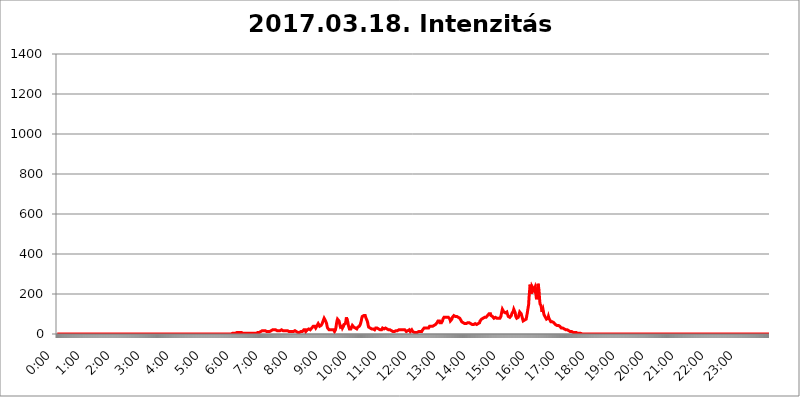
| Category | 2017.03.18. Intenzitás [W/m^2] |
|---|---|
| 0.0 | 0 |
| 0.0006944444444444445 | 0 |
| 0.001388888888888889 | 0 |
| 0.0020833333333333333 | 0 |
| 0.002777777777777778 | 0 |
| 0.003472222222222222 | 0 |
| 0.004166666666666667 | 0 |
| 0.004861111111111111 | 0 |
| 0.005555555555555556 | 0 |
| 0.0062499999999999995 | 0 |
| 0.006944444444444444 | 0 |
| 0.007638888888888889 | 0 |
| 0.008333333333333333 | 0 |
| 0.009027777777777779 | 0 |
| 0.009722222222222222 | 0 |
| 0.010416666666666666 | 0 |
| 0.011111111111111112 | 0 |
| 0.011805555555555555 | 0 |
| 0.012499999999999999 | 0 |
| 0.013194444444444444 | 0 |
| 0.013888888888888888 | 0 |
| 0.014583333333333332 | 0 |
| 0.015277777777777777 | 0 |
| 0.015972222222222224 | 0 |
| 0.016666666666666666 | 0 |
| 0.017361111111111112 | 0 |
| 0.018055555555555557 | 0 |
| 0.01875 | 0 |
| 0.019444444444444445 | 0 |
| 0.02013888888888889 | 0 |
| 0.020833333333333332 | 0 |
| 0.02152777777777778 | 0 |
| 0.022222222222222223 | 0 |
| 0.02291666666666667 | 0 |
| 0.02361111111111111 | 0 |
| 0.024305555555555556 | 0 |
| 0.024999999999999998 | 0 |
| 0.025694444444444447 | 0 |
| 0.02638888888888889 | 0 |
| 0.027083333333333334 | 0 |
| 0.027777777777777776 | 0 |
| 0.02847222222222222 | 0 |
| 0.029166666666666664 | 0 |
| 0.029861111111111113 | 0 |
| 0.030555555555555555 | 0 |
| 0.03125 | 0 |
| 0.03194444444444445 | 0 |
| 0.03263888888888889 | 0 |
| 0.03333333333333333 | 0 |
| 0.034027777777777775 | 0 |
| 0.034722222222222224 | 0 |
| 0.035416666666666666 | 0 |
| 0.036111111111111115 | 0 |
| 0.03680555555555556 | 0 |
| 0.0375 | 0 |
| 0.03819444444444444 | 0 |
| 0.03888888888888889 | 0 |
| 0.03958333333333333 | 0 |
| 0.04027777777777778 | 0 |
| 0.04097222222222222 | 0 |
| 0.041666666666666664 | 0 |
| 0.042361111111111106 | 0 |
| 0.04305555555555556 | 0 |
| 0.043750000000000004 | 0 |
| 0.044444444444444446 | 0 |
| 0.04513888888888889 | 0 |
| 0.04583333333333334 | 0 |
| 0.04652777777777778 | 0 |
| 0.04722222222222222 | 0 |
| 0.04791666666666666 | 0 |
| 0.04861111111111111 | 0 |
| 0.049305555555555554 | 0 |
| 0.049999999999999996 | 0 |
| 0.05069444444444445 | 0 |
| 0.051388888888888894 | 0 |
| 0.052083333333333336 | 0 |
| 0.05277777777777778 | 0 |
| 0.05347222222222222 | 0 |
| 0.05416666666666667 | 0 |
| 0.05486111111111111 | 0 |
| 0.05555555555555555 | 0 |
| 0.05625 | 0 |
| 0.05694444444444444 | 0 |
| 0.057638888888888885 | 0 |
| 0.05833333333333333 | 0 |
| 0.05902777777777778 | 0 |
| 0.059722222222222225 | 0 |
| 0.06041666666666667 | 0 |
| 0.061111111111111116 | 0 |
| 0.06180555555555556 | 0 |
| 0.0625 | 0 |
| 0.06319444444444444 | 0 |
| 0.06388888888888888 | 0 |
| 0.06458333333333334 | 0 |
| 0.06527777777777778 | 0 |
| 0.06597222222222222 | 0 |
| 0.06666666666666667 | 0 |
| 0.06736111111111111 | 0 |
| 0.06805555555555555 | 0 |
| 0.06874999999999999 | 0 |
| 0.06944444444444443 | 0 |
| 0.07013888888888889 | 0 |
| 0.07083333333333333 | 0 |
| 0.07152777777777779 | 0 |
| 0.07222222222222223 | 0 |
| 0.07291666666666667 | 0 |
| 0.07361111111111111 | 0 |
| 0.07430555555555556 | 0 |
| 0.075 | 0 |
| 0.07569444444444444 | 0 |
| 0.0763888888888889 | 0 |
| 0.07708333333333334 | 0 |
| 0.07777777777777778 | 0 |
| 0.07847222222222222 | 0 |
| 0.07916666666666666 | 0 |
| 0.0798611111111111 | 0 |
| 0.08055555555555556 | 0 |
| 0.08125 | 0 |
| 0.08194444444444444 | 0 |
| 0.08263888888888889 | 0 |
| 0.08333333333333333 | 0 |
| 0.08402777777777777 | 0 |
| 0.08472222222222221 | 0 |
| 0.08541666666666665 | 0 |
| 0.08611111111111112 | 0 |
| 0.08680555555555557 | 0 |
| 0.08750000000000001 | 0 |
| 0.08819444444444445 | 0 |
| 0.08888888888888889 | 0 |
| 0.08958333333333333 | 0 |
| 0.09027777777777778 | 0 |
| 0.09097222222222222 | 0 |
| 0.09166666666666667 | 0 |
| 0.09236111111111112 | 0 |
| 0.09305555555555556 | 0 |
| 0.09375 | 0 |
| 0.09444444444444444 | 0 |
| 0.09513888888888888 | 0 |
| 0.09583333333333333 | 0 |
| 0.09652777777777777 | 0 |
| 0.09722222222222222 | 0 |
| 0.09791666666666667 | 0 |
| 0.09861111111111111 | 0 |
| 0.09930555555555555 | 0 |
| 0.09999999999999999 | 0 |
| 0.10069444444444443 | 0 |
| 0.1013888888888889 | 0 |
| 0.10208333333333335 | 0 |
| 0.10277777777777779 | 0 |
| 0.10347222222222223 | 0 |
| 0.10416666666666667 | 0 |
| 0.10486111111111111 | 0 |
| 0.10555555555555556 | 0 |
| 0.10625 | 0 |
| 0.10694444444444444 | 0 |
| 0.1076388888888889 | 0 |
| 0.10833333333333334 | 0 |
| 0.10902777777777778 | 0 |
| 0.10972222222222222 | 0 |
| 0.1111111111111111 | 0 |
| 0.11180555555555556 | 0 |
| 0.11180555555555556 | 0 |
| 0.1125 | 0 |
| 0.11319444444444444 | 0 |
| 0.11388888888888889 | 0 |
| 0.11458333333333333 | 0 |
| 0.11527777777777777 | 0 |
| 0.11597222222222221 | 0 |
| 0.11666666666666665 | 0 |
| 0.1173611111111111 | 0 |
| 0.11805555555555557 | 0 |
| 0.11944444444444445 | 0 |
| 0.12013888888888889 | 0 |
| 0.12083333333333333 | 0 |
| 0.12152777777777778 | 0 |
| 0.12222222222222223 | 0 |
| 0.12291666666666667 | 0 |
| 0.12291666666666667 | 0 |
| 0.12361111111111112 | 0 |
| 0.12430555555555556 | 0 |
| 0.125 | 0 |
| 0.12569444444444444 | 0 |
| 0.12638888888888888 | 0 |
| 0.12708333333333333 | 0 |
| 0.16875 | 0 |
| 0.12847222222222224 | 0 |
| 0.12916666666666668 | 0 |
| 0.12986111111111112 | 0 |
| 0.13055555555555556 | 0 |
| 0.13125 | 0 |
| 0.13194444444444445 | 0 |
| 0.1326388888888889 | 0 |
| 0.13333333333333333 | 0 |
| 0.13402777777777777 | 0 |
| 0.13402777777777777 | 0 |
| 0.13472222222222222 | 0 |
| 0.13541666666666666 | 0 |
| 0.1361111111111111 | 0 |
| 0.13749999999999998 | 0 |
| 0.13819444444444443 | 0 |
| 0.1388888888888889 | 0 |
| 0.13958333333333334 | 0 |
| 0.14027777777777778 | 0 |
| 0.14097222222222222 | 0 |
| 0.14166666666666666 | 0 |
| 0.1423611111111111 | 0 |
| 0.14305555555555557 | 0 |
| 0.14375000000000002 | 0 |
| 0.14444444444444446 | 0 |
| 0.1451388888888889 | 0 |
| 0.1451388888888889 | 0 |
| 0.14652777777777778 | 0 |
| 0.14722222222222223 | 0 |
| 0.14791666666666667 | 0 |
| 0.1486111111111111 | 0 |
| 0.14930555555555555 | 0 |
| 0.15 | 0 |
| 0.15069444444444444 | 0 |
| 0.15138888888888888 | 0 |
| 0.15208333333333332 | 0 |
| 0.15277777777777776 | 0 |
| 0.15347222222222223 | 0 |
| 0.15416666666666667 | 0 |
| 0.15486111111111112 | 0 |
| 0.15555555555555556 | 0 |
| 0.15625 | 0 |
| 0.15694444444444444 | 0 |
| 0.15763888888888888 | 0 |
| 0.15833333333333333 | 0 |
| 0.15902777777777777 | 0 |
| 0.15972222222222224 | 0 |
| 0.16041666666666668 | 0 |
| 0.16111111111111112 | 0 |
| 0.16180555555555556 | 0 |
| 0.1625 | 0 |
| 0.16319444444444445 | 0 |
| 0.1638888888888889 | 0 |
| 0.16458333333333333 | 0 |
| 0.16527777777777777 | 0 |
| 0.16597222222222222 | 0 |
| 0.16666666666666666 | 0 |
| 0.1673611111111111 | 0 |
| 0.16805555555555554 | 0 |
| 0.16874999999999998 | 0 |
| 0.16944444444444443 | 0 |
| 0.17013888888888887 | 0 |
| 0.1708333333333333 | 0 |
| 0.17152777777777775 | 0 |
| 0.17222222222222225 | 0 |
| 0.1729166666666667 | 0 |
| 0.17361111111111113 | 0 |
| 0.17430555555555557 | 0 |
| 0.17500000000000002 | 0 |
| 0.17569444444444446 | 0 |
| 0.1763888888888889 | 0 |
| 0.17708333333333334 | 0 |
| 0.17777777777777778 | 0 |
| 0.17847222222222223 | 0 |
| 0.17916666666666667 | 0 |
| 0.1798611111111111 | 0 |
| 0.18055555555555555 | 0 |
| 0.18125 | 0 |
| 0.18194444444444444 | 0 |
| 0.1826388888888889 | 0 |
| 0.18333333333333335 | 0 |
| 0.1840277777777778 | 0 |
| 0.18472222222222223 | 0 |
| 0.18541666666666667 | 0 |
| 0.18611111111111112 | 0 |
| 0.18680555555555556 | 0 |
| 0.1875 | 0 |
| 0.18819444444444444 | 0 |
| 0.18888888888888888 | 0 |
| 0.18958333333333333 | 0 |
| 0.19027777777777777 | 0 |
| 0.1909722222222222 | 0 |
| 0.19166666666666665 | 0 |
| 0.19236111111111112 | 0 |
| 0.19305555555555554 | 0 |
| 0.19375 | 0 |
| 0.19444444444444445 | 0 |
| 0.1951388888888889 | 0 |
| 0.19583333333333333 | 0 |
| 0.19652777777777777 | 0 |
| 0.19722222222222222 | 0 |
| 0.19791666666666666 | 0 |
| 0.1986111111111111 | 0 |
| 0.19930555555555554 | 0 |
| 0.19999999999999998 | 0 |
| 0.20069444444444443 | 0 |
| 0.20138888888888887 | 0 |
| 0.2020833333333333 | 0 |
| 0.2027777777777778 | 0 |
| 0.2034722222222222 | 0 |
| 0.2041666666666667 | 0 |
| 0.20486111111111113 | 0 |
| 0.20555555555555557 | 0 |
| 0.20625000000000002 | 0 |
| 0.20694444444444446 | 0 |
| 0.2076388888888889 | 0 |
| 0.20833333333333334 | 0 |
| 0.20902777777777778 | 0 |
| 0.20972222222222223 | 0 |
| 0.21041666666666667 | 0 |
| 0.2111111111111111 | 0 |
| 0.21180555555555555 | 0 |
| 0.2125 | 0 |
| 0.21319444444444444 | 0 |
| 0.2138888888888889 | 0 |
| 0.21458333333333335 | 0 |
| 0.2152777777777778 | 0 |
| 0.21597222222222223 | 0 |
| 0.21666666666666667 | 0 |
| 0.21736111111111112 | 0 |
| 0.21805555555555556 | 0 |
| 0.21875 | 0 |
| 0.21944444444444444 | 0 |
| 0.22013888888888888 | 0 |
| 0.22083333333333333 | 0 |
| 0.22152777777777777 | 0 |
| 0.2222222222222222 | 0 |
| 0.22291666666666665 | 0 |
| 0.2236111111111111 | 0 |
| 0.22430555555555556 | 0 |
| 0.225 | 0 |
| 0.22569444444444445 | 0 |
| 0.2263888888888889 | 0 |
| 0.22708333333333333 | 0 |
| 0.22777777777777777 | 0 |
| 0.22847222222222222 | 0 |
| 0.22916666666666666 | 0 |
| 0.2298611111111111 | 0 |
| 0.23055555555555554 | 0 |
| 0.23124999999999998 | 0 |
| 0.23194444444444443 | 0 |
| 0.23263888888888887 | 0 |
| 0.2333333333333333 | 0 |
| 0.2340277777777778 | 0 |
| 0.2347222222222222 | 0 |
| 0.2354166666666667 | 0 |
| 0.23611111111111113 | 0 |
| 0.23680555555555557 | 0 |
| 0.23750000000000002 | 0 |
| 0.23819444444444446 | 0 |
| 0.2388888888888889 | 0 |
| 0.23958333333333334 | 0 |
| 0.24027777777777778 | 0 |
| 0.24097222222222223 | 0 |
| 0.24166666666666667 | 0 |
| 0.2423611111111111 | 0 |
| 0.24305555555555555 | 0 |
| 0.24375 | 0 |
| 0.24444444444444446 | 0 |
| 0.24513888888888888 | 0 |
| 0.24583333333333335 | 3.525 |
| 0.2465277777777778 | 0 |
| 0.24722222222222223 | 3.525 |
| 0.24791666666666667 | 3.525 |
| 0.24861111111111112 | 3.525 |
| 0.24930555555555556 | 3.525 |
| 0.25 | 3.525 |
| 0.25069444444444444 | 7.887 |
| 0.2513888888888889 | 7.887 |
| 0.2520833333333333 | 7.887 |
| 0.25277777777777777 | 7.887 |
| 0.2534722222222222 | 7.887 |
| 0.25416666666666665 | 7.887 |
| 0.2548611111111111 | 7.887 |
| 0.2555555555555556 | 7.887 |
| 0.25625000000000003 | 7.887 |
| 0.2569444444444445 | 7.887 |
| 0.2576388888888889 | 7.887 |
| 0.25833333333333336 | 7.887 |
| 0.2590277777777778 | 7.887 |
| 0.25972222222222224 | 7.887 |
| 0.2604166666666667 | 3.525 |
| 0.2611111111111111 | 3.525 |
| 0.26180555555555557 | 3.525 |
| 0.2625 | 3.525 |
| 0.26319444444444445 | 3.525 |
| 0.2638888888888889 | 3.525 |
| 0.26458333333333334 | 3.525 |
| 0.2652777777777778 | 3.525 |
| 0.2659722222222222 | 3.525 |
| 0.26666666666666666 | 3.525 |
| 0.2673611111111111 | 3.525 |
| 0.26805555555555555 | 3.525 |
| 0.26875 | 3.525 |
| 0.26944444444444443 | 3.525 |
| 0.2701388888888889 | 3.525 |
| 0.2708333333333333 | 3.525 |
| 0.27152777777777776 | 3.525 |
| 0.2722222222222222 | 3.525 |
| 0.27291666666666664 | 3.525 |
| 0.2736111111111111 | 3.525 |
| 0.2743055555555555 | 3.525 |
| 0.27499999999999997 | 3.525 |
| 0.27569444444444446 | 3.525 |
| 0.27638888888888885 | 3.525 |
| 0.27708333333333335 | 3.525 |
| 0.2777777777777778 | 3.525 |
| 0.27847222222222223 | 3.525 |
| 0.2791666666666667 | 3.525 |
| 0.2798611111111111 | 3.525 |
| 0.28055555555555556 | 3.525 |
| 0.28125 | 7.887 |
| 0.28194444444444444 | 7.887 |
| 0.2826388888888889 | 7.887 |
| 0.2833333333333333 | 7.887 |
| 0.28402777777777777 | 7.887 |
| 0.2847222222222222 | 12.257 |
| 0.28541666666666665 | 12.257 |
| 0.28611111111111115 | 12.257 |
| 0.28680555555555554 | 12.257 |
| 0.28750000000000003 | 16.636 |
| 0.2881944444444445 | 16.636 |
| 0.2888888888888889 | 16.636 |
| 0.28958333333333336 | 16.636 |
| 0.2902777777777778 | 16.636 |
| 0.29097222222222224 | 12.257 |
| 0.2916666666666667 | 16.636 |
| 0.2923611111111111 | 12.257 |
| 0.29305555555555557 | 12.257 |
| 0.29375 | 12.257 |
| 0.29444444444444445 | 16.636 |
| 0.2951388888888889 | 12.257 |
| 0.29583333333333334 | 12.257 |
| 0.2965277777777778 | 12.257 |
| 0.2972222222222222 | 12.257 |
| 0.29791666666666666 | 12.257 |
| 0.2986111111111111 | 12.257 |
| 0.29930555555555555 | 12.257 |
| 0.3 | 16.636 |
| 0.30069444444444443 | 16.636 |
| 0.3013888888888889 | 16.636 |
| 0.3020833333333333 | 21.024 |
| 0.30277777777777776 | 21.024 |
| 0.3034722222222222 | 21.024 |
| 0.30416666666666664 | 21.024 |
| 0.3048611111111111 | 21.024 |
| 0.3055555555555555 | 21.024 |
| 0.30624999999999997 | 21.024 |
| 0.3069444444444444 | 16.636 |
| 0.3076388888888889 | 16.636 |
| 0.30833333333333335 | 16.636 |
| 0.3090277777777778 | 16.636 |
| 0.30972222222222223 | 16.636 |
| 0.3104166666666667 | 16.636 |
| 0.3111111111111111 | 16.636 |
| 0.31180555555555556 | 16.636 |
| 0.3125 | 16.636 |
| 0.31319444444444444 | 21.024 |
| 0.3138888888888889 | 21.024 |
| 0.3145833333333333 | 21.024 |
| 0.31527777777777777 | 21.024 |
| 0.3159722222222222 | 16.636 |
| 0.31666666666666665 | 16.636 |
| 0.31736111111111115 | 16.636 |
| 0.31805555555555554 | 16.636 |
| 0.31875000000000003 | 16.636 |
| 0.3194444444444445 | 16.636 |
| 0.3201388888888889 | 16.636 |
| 0.32083333333333336 | 16.636 |
| 0.3215277777777778 | 16.636 |
| 0.32222222222222224 | 16.636 |
| 0.3229166666666667 | 16.636 |
| 0.3236111111111111 | 12.257 |
| 0.32430555555555557 | 12.257 |
| 0.325 | 12.257 |
| 0.32569444444444445 | 12.257 |
| 0.3263888888888889 | 12.257 |
| 0.32708333333333334 | 12.257 |
| 0.3277777777777778 | 12.257 |
| 0.3284722222222222 | 12.257 |
| 0.32916666666666666 | 12.257 |
| 0.3298611111111111 | 12.257 |
| 0.33055555555555555 | 12.257 |
| 0.33125 | 12.257 |
| 0.33194444444444443 | 16.636 |
| 0.3326388888888889 | 16.636 |
| 0.3333333333333333 | 16.636 |
| 0.3340277777777778 | 16.636 |
| 0.3347222222222222 | 16.636 |
| 0.3354166666666667 | 12.257 |
| 0.3361111111111111 | 12.257 |
| 0.3368055555555556 | 12.257 |
| 0.33749999999999997 | 7.887 |
| 0.33819444444444446 | 7.887 |
| 0.33888888888888885 | 7.887 |
| 0.33958333333333335 | 7.887 |
| 0.34027777777777773 | 7.887 |
| 0.34097222222222223 | 12.257 |
| 0.3416666666666666 | 12.257 |
| 0.3423611111111111 | 12.257 |
| 0.3430555555555555 | 12.257 |
| 0.34375 | 12.257 |
| 0.3444444444444445 | 12.257 |
| 0.3451388888888889 | 16.636 |
| 0.3458333333333334 | 21.024 |
| 0.34652777777777777 | 25.419 |
| 0.34722222222222227 | 21.024 |
| 0.34791666666666665 | 21.024 |
| 0.34861111111111115 | 12.257 |
| 0.34930555555555554 | 12.257 |
| 0.35000000000000003 | 16.636 |
| 0.3506944444444444 | 21.024 |
| 0.3513888888888889 | 21.024 |
| 0.3520833333333333 | 21.024 |
| 0.3527777777777778 | 25.419 |
| 0.3534722222222222 | 25.419 |
| 0.3541666666666667 | 21.024 |
| 0.3548611111111111 | 21.024 |
| 0.35555555555555557 | 21.024 |
| 0.35625 | 25.419 |
| 0.35694444444444445 | 29.823 |
| 0.3576388888888889 | 34.234 |
| 0.35833333333333334 | 34.234 |
| 0.3590277777777778 | 38.653 |
| 0.3597222222222222 | 43.079 |
| 0.36041666666666666 | 38.653 |
| 0.3611111111111111 | 38.653 |
| 0.36180555555555555 | 34.234 |
| 0.3625 | 29.823 |
| 0.36319444444444443 | 29.823 |
| 0.3638888888888889 | 38.653 |
| 0.3645833333333333 | 43.079 |
| 0.3652777777777778 | 43.079 |
| 0.3659722222222222 | 51.951 |
| 0.3666666666666667 | 51.951 |
| 0.3673611111111111 | 47.511 |
| 0.3680555555555556 | 38.653 |
| 0.36874999999999997 | 34.234 |
| 0.36944444444444446 | 38.653 |
| 0.37013888888888885 | 43.079 |
| 0.37083333333333335 | 47.511 |
| 0.37152777777777773 | 51.951 |
| 0.37222222222222223 | 51.951 |
| 0.3729166666666666 | 65.31 |
| 0.3736111111111111 | 69.775 |
| 0.3743055555555555 | 78.722 |
| 0.375 | 83.205 |
| 0.3756944444444445 | 74.246 |
| 0.3763888888888889 | 65.31 |
| 0.3770833333333334 | 60.85 |
| 0.37777777777777777 | 51.951 |
| 0.37847222222222227 | 38.653 |
| 0.37916666666666665 | 29.823 |
| 0.37986111111111115 | 25.419 |
| 0.38055555555555554 | 25.419 |
| 0.38125000000000003 | 21.024 |
| 0.3819444444444444 | 21.024 |
| 0.3826388888888889 | 21.024 |
| 0.3833333333333333 | 21.024 |
| 0.3840277777777778 | 16.636 |
| 0.3847222222222222 | 16.636 |
| 0.3854166666666667 | 21.024 |
| 0.3861111111111111 | 21.024 |
| 0.38680555555555557 | 21.024 |
| 0.3875 | 21.024 |
| 0.38819444444444445 | 16.636 |
| 0.3888888888888889 | 12.257 |
| 0.38958333333333334 | 12.257 |
| 0.3902777777777778 | 21.024 |
| 0.3909722222222222 | 34.234 |
| 0.39166666666666666 | 51.951 |
| 0.3923611111111111 | 65.31 |
| 0.39305555555555555 | 74.246 |
| 0.39375 | 74.246 |
| 0.39444444444444443 | 74.246 |
| 0.3951388888888889 | 65.31 |
| 0.3958333333333333 | 56.398 |
| 0.3965277777777778 | 43.079 |
| 0.3972222222222222 | 34.234 |
| 0.3979166666666667 | 34.234 |
| 0.3986111111111111 | 38.653 |
| 0.3993055555555556 | 38.653 |
| 0.39999999999999997 | 29.823 |
| 0.40069444444444446 | 34.234 |
| 0.40138888888888885 | 38.653 |
| 0.40208333333333335 | 47.511 |
| 0.40277777777777773 | 47.511 |
| 0.40347222222222223 | 43.079 |
| 0.4041666666666666 | 51.951 |
| 0.4048611111111111 | 65.31 |
| 0.4055555555555555 | 83.205 |
| 0.40625 | 87.692 |
| 0.4069444444444445 | 78.722 |
| 0.4076388888888889 | 56.398 |
| 0.4083333333333334 | 43.079 |
| 0.40902777777777777 | 34.234 |
| 0.40972222222222227 | 25.419 |
| 0.41041666666666665 | 25.419 |
| 0.41111111111111115 | 25.419 |
| 0.41180555555555554 | 25.419 |
| 0.41250000000000003 | 25.419 |
| 0.4131944444444444 | 29.823 |
| 0.4138888888888889 | 43.079 |
| 0.4145833333333333 | 47.511 |
| 0.4152777777777778 | 38.653 |
| 0.4159722222222222 | 34.234 |
| 0.4166666666666667 | 29.823 |
| 0.4173611111111111 | 29.823 |
| 0.41805555555555557 | 29.823 |
| 0.41875 | 29.823 |
| 0.41944444444444445 | 25.419 |
| 0.4201388888888889 | 25.419 |
| 0.42083333333333334 | 29.823 |
| 0.4215277777777778 | 34.234 |
| 0.4222222222222222 | 34.234 |
| 0.42291666666666666 | 34.234 |
| 0.4236111111111111 | 38.653 |
| 0.42430555555555555 | 43.079 |
| 0.425 | 47.511 |
| 0.42569444444444443 | 56.398 |
| 0.4263888888888889 | 65.31 |
| 0.4270833333333333 | 78.722 |
| 0.4277777777777778 | 87.692 |
| 0.4284722222222222 | 92.184 |
| 0.4291666666666667 | 92.184 |
| 0.4298611111111111 | 92.184 |
| 0.4305555555555556 | 92.184 |
| 0.43124999999999997 | 92.184 |
| 0.43194444444444446 | 92.184 |
| 0.43263888888888885 | 83.205 |
| 0.43333333333333335 | 83.205 |
| 0.43402777777777773 | 78.722 |
| 0.43472222222222223 | 65.31 |
| 0.4354166666666666 | 56.398 |
| 0.4361111111111111 | 43.079 |
| 0.4368055555555555 | 34.234 |
| 0.4375 | 29.823 |
| 0.4381944444444445 | 29.823 |
| 0.4388888888888889 | 29.823 |
| 0.4395833333333334 | 34.234 |
| 0.44027777777777777 | 29.823 |
| 0.44097222222222227 | 25.419 |
| 0.44166666666666665 | 25.419 |
| 0.44236111111111115 | 25.419 |
| 0.44305555555555554 | 25.419 |
| 0.44375000000000003 | 25.419 |
| 0.4444444444444444 | 21.024 |
| 0.4451388888888889 | 21.024 |
| 0.4458333333333333 | 21.024 |
| 0.4465277777777778 | 29.823 |
| 0.4472222222222222 | 34.234 |
| 0.4479166666666667 | 34.234 |
| 0.4486111111111111 | 29.823 |
| 0.44930555555555557 | 25.419 |
| 0.45 | 25.419 |
| 0.45069444444444445 | 25.419 |
| 0.4513888888888889 | 21.024 |
| 0.45208333333333334 | 21.024 |
| 0.4527777777777778 | 21.024 |
| 0.4534722222222222 | 21.024 |
| 0.45416666666666666 | 21.024 |
| 0.4548611111111111 | 21.024 |
| 0.45555555555555555 | 21.024 |
| 0.45625 | 29.823 |
| 0.45694444444444443 | 29.823 |
| 0.4576388888888889 | 29.823 |
| 0.4583333333333333 | 25.419 |
| 0.4590277777777778 | 29.823 |
| 0.4597222222222222 | 29.823 |
| 0.4604166666666667 | 29.823 |
| 0.4611111111111111 | 29.823 |
| 0.4618055555555556 | 29.823 |
| 0.46249999999999997 | 25.419 |
| 0.46319444444444446 | 25.419 |
| 0.46388888888888885 | 25.419 |
| 0.46458333333333335 | 21.024 |
| 0.46527777777777773 | 21.024 |
| 0.46597222222222223 | 21.024 |
| 0.4666666666666666 | 21.024 |
| 0.4673611111111111 | 21.024 |
| 0.4680555555555555 | 16.636 |
| 0.46875 | 16.636 |
| 0.4694444444444445 | 12.257 |
| 0.4701388888888889 | 12.257 |
| 0.4708333333333334 | 12.257 |
| 0.47152777777777777 | 12.257 |
| 0.47222222222222227 | 12.257 |
| 0.47291666666666665 | 12.257 |
| 0.47361111111111115 | 16.636 |
| 0.47430555555555554 | 16.636 |
| 0.47500000000000003 | 16.636 |
| 0.4756944444444444 | 16.636 |
| 0.4763888888888889 | 16.636 |
| 0.4770833333333333 | 16.636 |
| 0.4777777777777778 | 16.636 |
| 0.4784722222222222 | 21.024 |
| 0.4791666666666667 | 21.024 |
| 0.4798611111111111 | 16.636 |
| 0.48055555555555557 | 16.636 |
| 0.48125 | 21.024 |
| 0.48194444444444445 | 21.024 |
| 0.4826388888888889 | 21.024 |
| 0.48333333333333334 | 21.024 |
| 0.4840277777777778 | 21.024 |
| 0.4847222222222222 | 21.024 |
| 0.48541666666666666 | 21.024 |
| 0.4861111111111111 | 21.024 |
| 0.48680555555555555 | 16.636 |
| 0.4875 | 21.024 |
| 0.48819444444444443 | 16.636 |
| 0.4888888888888889 | 16.636 |
| 0.4895833333333333 | 12.257 |
| 0.4902777777777778 | 12.257 |
| 0.4909722222222222 | 12.257 |
| 0.4916666666666667 | 16.636 |
| 0.4923611111111111 | 21.024 |
| 0.4930555555555556 | 21.024 |
| 0.49374999999999997 | 21.024 |
| 0.49444444444444446 | 16.636 |
| 0.49513888888888885 | 12.257 |
| 0.49583333333333335 | 12.257 |
| 0.49652777777777773 | 16.636 |
| 0.49722222222222223 | 21.024 |
| 0.4979166666666666 | 16.636 |
| 0.4986111111111111 | 12.257 |
| 0.4993055555555555 | 12.257 |
| 0.5 | 7.887 |
| 0.5006944444444444 | 7.887 |
| 0.5013888888888889 | 7.887 |
| 0.5020833333333333 | 7.887 |
| 0.5027777777777778 | 7.887 |
| 0.5034722222222222 | 7.887 |
| 0.5041666666666667 | 7.887 |
| 0.5048611111111111 | 7.887 |
| 0.5055555555555555 | 12.257 |
| 0.50625 | 12.257 |
| 0.5069444444444444 | 12.257 |
| 0.5076388888888889 | 12.257 |
| 0.5083333333333333 | 12.257 |
| 0.5090277777777777 | 12.257 |
| 0.5097222222222222 | 16.636 |
| 0.5104166666666666 | 12.257 |
| 0.5111111111111112 | 12.257 |
| 0.5118055555555555 | 16.636 |
| 0.5125000000000001 | 21.024 |
| 0.5131944444444444 | 21.024 |
| 0.513888888888889 | 25.419 |
| 0.5145833333333333 | 29.823 |
| 0.5152777777777778 | 25.419 |
| 0.5159722222222222 | 25.419 |
| 0.5166666666666667 | 29.823 |
| 0.517361111111111 | 29.823 |
| 0.5180555555555556 | 34.234 |
| 0.5187499999999999 | 29.823 |
| 0.5194444444444445 | 29.823 |
| 0.5201388888888888 | 25.419 |
| 0.5208333333333334 | 29.823 |
| 0.5215277777777778 | 34.234 |
| 0.5222222222222223 | 38.653 |
| 0.5229166666666667 | 38.653 |
| 0.5236111111111111 | 38.653 |
| 0.5243055555555556 | 38.653 |
| 0.525 | 38.653 |
| 0.5256944444444445 | 38.653 |
| 0.5263888888888889 | 38.653 |
| 0.5270833333333333 | 43.079 |
| 0.5277777777777778 | 43.079 |
| 0.5284722222222222 | 43.079 |
| 0.5291666666666667 | 43.079 |
| 0.5298611111111111 | 47.511 |
| 0.5305555555555556 | 47.511 |
| 0.53125 | 51.951 |
| 0.5319444444444444 | 51.951 |
| 0.5326388888888889 | 56.398 |
| 0.5333333333333333 | 60.85 |
| 0.5340277777777778 | 65.31 |
| 0.5347222222222222 | 69.775 |
| 0.5354166666666667 | 69.775 |
| 0.5361111111111111 | 65.31 |
| 0.5368055555555555 | 56.398 |
| 0.5375 | 56.398 |
| 0.5381944444444444 | 56.398 |
| 0.5388888888888889 | 56.398 |
| 0.5395833333333333 | 60.85 |
| 0.5402777777777777 | 65.31 |
| 0.5409722222222222 | 74.246 |
| 0.5416666666666666 | 78.722 |
| 0.5423611111111112 | 83.205 |
| 0.5430555555555555 | 83.205 |
| 0.5437500000000001 | 83.205 |
| 0.5444444444444444 | 83.205 |
| 0.545138888888889 | 83.205 |
| 0.5458333333333333 | 83.205 |
| 0.5465277777777778 | 83.205 |
| 0.5472222222222222 | 83.205 |
| 0.5479166666666667 | 83.205 |
| 0.548611111111111 | 83.205 |
| 0.5493055555555556 | 78.722 |
| 0.5499999999999999 | 78.722 |
| 0.5506944444444445 | 74.246 |
| 0.5513888888888888 | 65.31 |
| 0.5520833333333334 | 65.31 |
| 0.5527777777777778 | 69.775 |
| 0.5534722222222223 | 74.246 |
| 0.5541666666666667 | 83.205 |
| 0.5548611111111111 | 87.692 |
| 0.5555555555555556 | 87.692 |
| 0.55625 | 92.184 |
| 0.5569444444444445 | 92.184 |
| 0.5576388888888889 | 92.184 |
| 0.5583333333333333 | 87.692 |
| 0.5590277777777778 | 87.692 |
| 0.5597222222222222 | 87.692 |
| 0.5604166666666667 | 87.692 |
| 0.5611111111111111 | 87.692 |
| 0.5618055555555556 | 83.205 |
| 0.5625 | 83.205 |
| 0.5631944444444444 | 83.205 |
| 0.5638888888888889 | 83.205 |
| 0.5645833333333333 | 78.722 |
| 0.5652777777777778 | 78.722 |
| 0.5659722222222222 | 69.775 |
| 0.5666666666666667 | 65.31 |
| 0.5673611111111111 | 60.85 |
| 0.5680555555555555 | 56.398 |
| 0.56875 | 56.398 |
| 0.5694444444444444 | 56.398 |
| 0.5701388888888889 | 56.398 |
| 0.5708333333333333 | 51.951 |
| 0.5715277777777777 | 51.951 |
| 0.5722222222222222 | 51.951 |
| 0.5729166666666666 | 51.951 |
| 0.5736111111111112 | 51.951 |
| 0.5743055555555555 | 51.951 |
| 0.5750000000000001 | 51.951 |
| 0.5756944444444444 | 56.398 |
| 0.576388888888889 | 56.398 |
| 0.5770833333333333 | 60.85 |
| 0.5777777777777778 | 56.398 |
| 0.5784722222222222 | 56.398 |
| 0.5791666666666667 | 51.951 |
| 0.579861111111111 | 51.951 |
| 0.5805555555555556 | 47.511 |
| 0.5812499999999999 | 47.511 |
| 0.5819444444444445 | 47.511 |
| 0.5826388888888888 | 47.511 |
| 0.5833333333333334 | 47.511 |
| 0.5840277777777778 | 47.511 |
| 0.5847222222222223 | 47.511 |
| 0.5854166666666667 | 47.511 |
| 0.5861111111111111 | 51.951 |
| 0.5868055555555556 | 51.951 |
| 0.5875 | 47.511 |
| 0.5881944444444445 | 47.511 |
| 0.5888888888888889 | 51.951 |
| 0.5895833333333333 | 51.951 |
| 0.5902777777777778 | 51.951 |
| 0.5909722222222222 | 51.951 |
| 0.5916666666666667 | 51.951 |
| 0.5923611111111111 | 56.398 |
| 0.5930555555555556 | 65.31 |
| 0.59375 | 65.31 |
| 0.5944444444444444 | 69.775 |
| 0.5951388888888889 | 74.246 |
| 0.5958333333333333 | 74.246 |
| 0.5965277777777778 | 78.722 |
| 0.5972222222222222 | 78.722 |
| 0.5979166666666667 | 78.722 |
| 0.5986111111111111 | 78.722 |
| 0.5993055555555555 | 83.205 |
| 0.6 | 83.205 |
| 0.6006944444444444 | 83.205 |
| 0.6013888888888889 | 83.205 |
| 0.6020833333333333 | 87.692 |
| 0.6027777777777777 | 87.692 |
| 0.6034722222222222 | 92.184 |
| 0.6041666666666666 | 96.682 |
| 0.6048611111111112 | 96.682 |
| 0.6055555555555555 | 101.184 |
| 0.6062500000000001 | 101.184 |
| 0.6069444444444444 | 101.184 |
| 0.607638888888889 | 101.184 |
| 0.6083333333333333 | 92.184 |
| 0.6090277777777778 | 92.184 |
| 0.6097222222222222 | 87.692 |
| 0.6104166666666667 | 87.692 |
| 0.611111111111111 | 83.205 |
| 0.6118055555555556 | 83.205 |
| 0.6124999999999999 | 78.722 |
| 0.6131944444444445 | 78.722 |
| 0.6138888888888888 | 83.205 |
| 0.6145833333333334 | 83.205 |
| 0.6152777777777778 | 83.205 |
| 0.6159722222222223 | 83.205 |
| 0.6166666666666667 | 78.722 |
| 0.6173611111111111 | 74.246 |
| 0.6180555555555556 | 74.246 |
| 0.61875 | 78.722 |
| 0.6194444444444445 | 78.722 |
| 0.6201388888888889 | 74.246 |
| 0.6208333333333333 | 78.722 |
| 0.6215277777777778 | 83.205 |
| 0.6222222222222222 | 87.692 |
| 0.6229166666666667 | 101.184 |
| 0.6236111111111111 | 101.184 |
| 0.6243055555555556 | 123.758 |
| 0.625 | 128.284 |
| 0.6256944444444444 | 119.235 |
| 0.6263888888888889 | 110.201 |
| 0.6270833333333333 | 110.201 |
| 0.6277777777777778 | 110.201 |
| 0.6284722222222222 | 105.69 |
| 0.6291666666666667 | 110.201 |
| 0.6298611111111111 | 110.201 |
| 0.6305555555555555 | 110.201 |
| 0.63125 | 101.184 |
| 0.6319444444444444 | 96.682 |
| 0.6326388888888889 | 87.692 |
| 0.6333333333333333 | 87.692 |
| 0.6340277777777777 | 83.205 |
| 0.6347222222222222 | 83.205 |
| 0.6354166666666666 | 83.205 |
| 0.6361111111111112 | 87.692 |
| 0.6368055555555555 | 92.184 |
| 0.6375000000000001 | 101.184 |
| 0.6381944444444444 | 101.184 |
| 0.638888888888889 | 101.184 |
| 0.6395833333333333 | 114.716 |
| 0.6402777777777778 | 123.758 |
| 0.6409722222222222 | 119.235 |
| 0.6416666666666667 | 119.235 |
| 0.642361111111111 | 105.69 |
| 0.6430555555555556 | 87.692 |
| 0.6437499999999999 | 83.205 |
| 0.6444444444444445 | 78.722 |
| 0.6451388888888888 | 78.722 |
| 0.6458333333333334 | 74.246 |
| 0.6465277777777778 | 83.205 |
| 0.6472222222222223 | 87.692 |
| 0.6479166666666667 | 101.184 |
| 0.6486111111111111 | 110.201 |
| 0.6493055555555556 | 110.201 |
| 0.65 | 110.201 |
| 0.6506944444444445 | 101.184 |
| 0.6513888888888889 | 92.184 |
| 0.6520833333333333 | 83.205 |
| 0.6527777777777778 | 74.246 |
| 0.6534722222222222 | 65.31 |
| 0.6541666666666667 | 65.31 |
| 0.6548611111111111 | 65.31 |
| 0.6555555555555556 | 69.775 |
| 0.65625 | 74.246 |
| 0.6569444444444444 | 69.775 |
| 0.6576388888888889 | 74.246 |
| 0.6583333333333333 | 87.692 |
| 0.6590277777777778 | 101.184 |
| 0.6597222222222222 | 105.69 |
| 0.6604166666666667 | 105.69 |
| 0.6611111111111111 | 146.423 |
| 0.6618055555555555 | 187.378 |
| 0.6625 | 187.378 |
| 0.6631944444444444 | 246.689 |
| 0.6638888888888889 | 246.689 |
| 0.6645833333333333 | 242.127 |
| 0.6652777777777777 | 201.058 |
| 0.6659722222222222 | 237.564 |
| 0.6666666666666666 | 242.127 |
| 0.6673611111111111 | 228.436 |
| 0.6680555555555556 | 228.436 |
| 0.6687500000000001 | 219.309 |
| 0.6694444444444444 | 219.309 |
| 0.6701388888888888 | 233 |
| 0.6708333333333334 | 219.309 |
| 0.6715277777777778 | 191.937 |
| 0.6722222222222222 | 173.709 |
| 0.6729166666666666 | 191.937 |
| 0.6736111111111112 | 228.436 |
| 0.6743055555555556 | 251.251 |
| 0.6749999999999999 | 237.564 |
| 0.6756944444444444 | 219.309 |
| 0.6763888888888889 | 178.264 |
| 0.6770833333333334 | 150.964 |
| 0.6777777777777777 | 155.509 |
| 0.6784722222222223 | 141.884 |
| 0.6791666666666667 | 128.284 |
| 0.6798611111111111 | 110.201 |
| 0.6805555555555555 | 110.201 |
| 0.68125 | 123.758 |
| 0.6819444444444445 | 110.201 |
| 0.6826388888888889 | 96.682 |
| 0.6833333333333332 | 96.682 |
| 0.6840277777777778 | 101.184 |
| 0.6847222222222222 | 83.205 |
| 0.6854166666666667 | 83.205 |
| 0.686111111111111 | 74.246 |
| 0.6868055555555556 | 74.246 |
| 0.6875 | 74.246 |
| 0.6881944444444444 | 78.722 |
| 0.688888888888889 | 87.692 |
| 0.6895833333333333 | 78.722 |
| 0.6902777777777778 | 74.246 |
| 0.6909722222222222 | 69.775 |
| 0.6916666666666668 | 65.31 |
| 0.6923611111111111 | 60.85 |
| 0.6930555555555555 | 60.85 |
| 0.69375 | 60.85 |
| 0.6944444444444445 | 60.85 |
| 0.6951388888888889 | 60.85 |
| 0.6958333333333333 | 60.85 |
| 0.6965277777777777 | 56.398 |
| 0.6972222222222223 | 56.398 |
| 0.6979166666666666 | 51.951 |
| 0.6986111111111111 | 47.511 |
| 0.6993055555555556 | 47.511 |
| 0.7000000000000001 | 43.079 |
| 0.7006944444444444 | 43.079 |
| 0.7013888888888888 | 43.079 |
| 0.7020833333333334 | 38.653 |
| 0.7027777777777778 | 43.079 |
| 0.7034722222222222 | 43.079 |
| 0.7041666666666666 | 38.653 |
| 0.7048611111111112 | 38.653 |
| 0.7055555555555556 | 38.653 |
| 0.7062499999999999 | 34.234 |
| 0.7069444444444444 | 29.823 |
| 0.7076388888888889 | 29.823 |
| 0.7083333333333334 | 29.823 |
| 0.7090277777777777 | 29.823 |
| 0.7097222222222223 | 25.419 |
| 0.7104166666666667 | 25.419 |
| 0.7111111111111111 | 25.419 |
| 0.7118055555555555 | 29.823 |
| 0.7125 | 25.419 |
| 0.7131944444444445 | 21.024 |
| 0.7138888888888889 | 21.024 |
| 0.7145833333333332 | 21.024 |
| 0.7152777777777778 | 21.024 |
| 0.7159722222222222 | 21.024 |
| 0.7166666666666667 | 16.636 |
| 0.717361111111111 | 16.636 |
| 0.7180555555555556 | 16.636 |
| 0.71875 | 16.636 |
| 0.7194444444444444 | 12.257 |
| 0.720138888888889 | 12.257 |
| 0.7208333333333333 | 12.257 |
| 0.7215277777777778 | 12.257 |
| 0.7222222222222222 | 12.257 |
| 0.7229166666666668 | 12.257 |
| 0.7236111111111111 | 7.887 |
| 0.7243055555555555 | 7.887 |
| 0.725 | 7.887 |
| 0.7256944444444445 | 7.887 |
| 0.7263888888888889 | 7.887 |
| 0.7270833333333333 | 7.887 |
| 0.7277777777777777 | 7.887 |
| 0.7284722222222223 | 7.887 |
| 0.7291666666666666 | 3.525 |
| 0.7298611111111111 | 3.525 |
| 0.7305555555555556 | 3.525 |
| 0.7312500000000001 | 3.525 |
| 0.7319444444444444 | 3.525 |
| 0.7326388888888888 | 3.525 |
| 0.7333333333333334 | 3.525 |
| 0.7340277777777778 | 3.525 |
| 0.7347222222222222 | 3.525 |
| 0.7354166666666666 | 0 |
| 0.7361111111111112 | 0 |
| 0.7368055555555556 | 0 |
| 0.7374999999999999 | 0 |
| 0.7381944444444444 | 0 |
| 0.7388888888888889 | 0 |
| 0.7395833333333334 | 0 |
| 0.7402777777777777 | 0 |
| 0.7409722222222223 | 0 |
| 0.7416666666666667 | 0 |
| 0.7423611111111111 | 0 |
| 0.7430555555555555 | 0 |
| 0.74375 | 0 |
| 0.7444444444444445 | 0 |
| 0.7451388888888889 | 0 |
| 0.7458333333333332 | 0 |
| 0.7465277777777778 | 0 |
| 0.7472222222222222 | 0 |
| 0.7479166666666667 | 0 |
| 0.748611111111111 | 0 |
| 0.7493055555555556 | 0 |
| 0.75 | 0 |
| 0.7506944444444444 | 0 |
| 0.751388888888889 | 0 |
| 0.7520833333333333 | 0 |
| 0.7527777777777778 | 0 |
| 0.7534722222222222 | 0 |
| 0.7541666666666668 | 0 |
| 0.7548611111111111 | 0 |
| 0.7555555555555555 | 0 |
| 0.75625 | 0 |
| 0.7569444444444445 | 0 |
| 0.7576388888888889 | 0 |
| 0.7583333333333333 | 0 |
| 0.7590277777777777 | 0 |
| 0.7597222222222223 | 0 |
| 0.7604166666666666 | 0 |
| 0.7611111111111111 | 0 |
| 0.7618055555555556 | 0 |
| 0.7625000000000001 | 0 |
| 0.7631944444444444 | 0 |
| 0.7638888888888888 | 0 |
| 0.7645833333333334 | 0 |
| 0.7652777777777778 | 0 |
| 0.7659722222222222 | 0 |
| 0.7666666666666666 | 0 |
| 0.7673611111111112 | 0 |
| 0.7680555555555556 | 0 |
| 0.7687499999999999 | 0 |
| 0.7694444444444444 | 0 |
| 0.7701388888888889 | 0 |
| 0.7708333333333334 | 0 |
| 0.7715277777777777 | 0 |
| 0.7722222222222223 | 0 |
| 0.7729166666666667 | 0 |
| 0.7736111111111111 | 0 |
| 0.7743055555555555 | 0 |
| 0.775 | 0 |
| 0.7756944444444445 | 0 |
| 0.7763888888888889 | 0 |
| 0.7770833333333332 | 0 |
| 0.7777777777777778 | 0 |
| 0.7784722222222222 | 0 |
| 0.7791666666666667 | 0 |
| 0.779861111111111 | 0 |
| 0.7805555555555556 | 0 |
| 0.78125 | 0 |
| 0.7819444444444444 | 0 |
| 0.782638888888889 | 0 |
| 0.7833333333333333 | 0 |
| 0.7840277777777778 | 0 |
| 0.7847222222222222 | 0 |
| 0.7854166666666668 | 0 |
| 0.7861111111111111 | 0 |
| 0.7868055555555555 | 0 |
| 0.7875 | 0 |
| 0.7881944444444445 | 0 |
| 0.7888888888888889 | 0 |
| 0.7895833333333333 | 0 |
| 0.7902777777777777 | 0 |
| 0.7909722222222223 | 0 |
| 0.7916666666666666 | 0 |
| 0.7923611111111111 | 0 |
| 0.7930555555555556 | 0 |
| 0.7937500000000001 | 0 |
| 0.7944444444444444 | 0 |
| 0.7951388888888888 | 0 |
| 0.7958333333333334 | 0 |
| 0.7965277777777778 | 0 |
| 0.7972222222222222 | 0 |
| 0.7979166666666666 | 0 |
| 0.7986111111111112 | 0 |
| 0.7993055555555556 | 0 |
| 0.7999999999999999 | 0 |
| 0.8006944444444444 | 0 |
| 0.8013888888888889 | 0 |
| 0.8020833333333334 | 0 |
| 0.8027777777777777 | 0 |
| 0.8034722222222223 | 0 |
| 0.8041666666666667 | 0 |
| 0.8048611111111111 | 0 |
| 0.8055555555555555 | 0 |
| 0.80625 | 0 |
| 0.8069444444444445 | 0 |
| 0.8076388888888889 | 0 |
| 0.8083333333333332 | 0 |
| 0.8090277777777778 | 0 |
| 0.8097222222222222 | 0 |
| 0.8104166666666667 | 0 |
| 0.811111111111111 | 0 |
| 0.8118055555555556 | 0 |
| 0.8125 | 0 |
| 0.8131944444444444 | 0 |
| 0.813888888888889 | 0 |
| 0.8145833333333333 | 0 |
| 0.8152777777777778 | 0 |
| 0.8159722222222222 | 0 |
| 0.8166666666666668 | 0 |
| 0.8173611111111111 | 0 |
| 0.8180555555555555 | 0 |
| 0.81875 | 0 |
| 0.8194444444444445 | 0 |
| 0.8201388888888889 | 0 |
| 0.8208333333333333 | 0 |
| 0.8215277777777777 | 0 |
| 0.8222222222222223 | 0 |
| 0.8229166666666666 | 0 |
| 0.8236111111111111 | 0 |
| 0.8243055555555556 | 0 |
| 0.8250000000000001 | 0 |
| 0.8256944444444444 | 0 |
| 0.8263888888888888 | 0 |
| 0.8270833333333334 | 0 |
| 0.8277777777777778 | 0 |
| 0.8284722222222222 | 0 |
| 0.8291666666666666 | 0 |
| 0.8298611111111112 | 0 |
| 0.8305555555555556 | 0 |
| 0.8312499999999999 | 0 |
| 0.8319444444444444 | 0 |
| 0.8326388888888889 | 0 |
| 0.8333333333333334 | 0 |
| 0.8340277777777777 | 0 |
| 0.8347222222222223 | 0 |
| 0.8354166666666667 | 0 |
| 0.8361111111111111 | 0 |
| 0.8368055555555555 | 0 |
| 0.8375 | 0 |
| 0.8381944444444445 | 0 |
| 0.8388888888888889 | 0 |
| 0.8395833333333332 | 0 |
| 0.8402777777777778 | 0 |
| 0.8409722222222222 | 0 |
| 0.8416666666666667 | 0 |
| 0.842361111111111 | 0 |
| 0.8430555555555556 | 0 |
| 0.84375 | 0 |
| 0.8444444444444444 | 0 |
| 0.845138888888889 | 0 |
| 0.8458333333333333 | 0 |
| 0.8465277777777778 | 0 |
| 0.8472222222222222 | 0 |
| 0.8479166666666668 | 0 |
| 0.8486111111111111 | 0 |
| 0.8493055555555555 | 0 |
| 0.85 | 0 |
| 0.8506944444444445 | 0 |
| 0.8513888888888889 | 0 |
| 0.8520833333333333 | 0 |
| 0.8527777777777777 | 0 |
| 0.8534722222222223 | 0 |
| 0.8541666666666666 | 0 |
| 0.8548611111111111 | 0 |
| 0.8555555555555556 | 0 |
| 0.8562500000000001 | 0 |
| 0.8569444444444444 | 0 |
| 0.8576388888888888 | 0 |
| 0.8583333333333334 | 0 |
| 0.8590277777777778 | 0 |
| 0.8597222222222222 | 0 |
| 0.8604166666666666 | 0 |
| 0.8611111111111112 | 0 |
| 0.8618055555555556 | 0 |
| 0.8624999999999999 | 0 |
| 0.8631944444444444 | 0 |
| 0.8638888888888889 | 0 |
| 0.8645833333333334 | 0 |
| 0.8652777777777777 | 0 |
| 0.8659722222222223 | 0 |
| 0.8666666666666667 | 0 |
| 0.8673611111111111 | 0 |
| 0.8680555555555555 | 0 |
| 0.86875 | 0 |
| 0.8694444444444445 | 0 |
| 0.8701388888888889 | 0 |
| 0.8708333333333332 | 0 |
| 0.8715277777777778 | 0 |
| 0.8722222222222222 | 0 |
| 0.8729166666666667 | 0 |
| 0.873611111111111 | 0 |
| 0.8743055555555556 | 0 |
| 0.875 | 0 |
| 0.8756944444444444 | 0 |
| 0.876388888888889 | 0 |
| 0.8770833333333333 | 0 |
| 0.8777777777777778 | 0 |
| 0.8784722222222222 | 0 |
| 0.8791666666666668 | 0 |
| 0.8798611111111111 | 0 |
| 0.8805555555555555 | 0 |
| 0.88125 | 0 |
| 0.8819444444444445 | 0 |
| 0.8826388888888889 | 0 |
| 0.8833333333333333 | 0 |
| 0.8840277777777777 | 0 |
| 0.8847222222222223 | 0 |
| 0.8854166666666666 | 0 |
| 0.8861111111111111 | 0 |
| 0.8868055555555556 | 0 |
| 0.8875000000000001 | 0 |
| 0.8881944444444444 | 0 |
| 0.8888888888888888 | 0 |
| 0.8895833333333334 | 0 |
| 0.8902777777777778 | 0 |
| 0.8909722222222222 | 0 |
| 0.8916666666666666 | 0 |
| 0.8923611111111112 | 0 |
| 0.8930555555555556 | 0 |
| 0.8937499999999999 | 0 |
| 0.8944444444444444 | 0 |
| 0.8951388888888889 | 0 |
| 0.8958333333333334 | 0 |
| 0.8965277777777777 | 0 |
| 0.8972222222222223 | 0 |
| 0.8979166666666667 | 0 |
| 0.8986111111111111 | 0 |
| 0.8993055555555555 | 0 |
| 0.9 | 0 |
| 0.9006944444444445 | 0 |
| 0.9013888888888889 | 0 |
| 0.9020833333333332 | 0 |
| 0.9027777777777778 | 0 |
| 0.9034722222222222 | 0 |
| 0.9041666666666667 | 0 |
| 0.904861111111111 | 0 |
| 0.9055555555555556 | 0 |
| 0.90625 | 0 |
| 0.9069444444444444 | 0 |
| 0.907638888888889 | 0 |
| 0.9083333333333333 | 0 |
| 0.9090277777777778 | 0 |
| 0.9097222222222222 | 0 |
| 0.9104166666666668 | 0 |
| 0.9111111111111111 | 0 |
| 0.9118055555555555 | 0 |
| 0.9125 | 0 |
| 0.9131944444444445 | 0 |
| 0.9138888888888889 | 0 |
| 0.9145833333333333 | 0 |
| 0.9152777777777777 | 0 |
| 0.9159722222222223 | 0 |
| 0.9166666666666666 | 0 |
| 0.9173611111111111 | 0 |
| 0.9180555555555556 | 0 |
| 0.9187500000000001 | 0 |
| 0.9194444444444444 | 0 |
| 0.9201388888888888 | 0 |
| 0.9208333333333334 | 0 |
| 0.9215277777777778 | 0 |
| 0.9222222222222222 | 0 |
| 0.9229166666666666 | 0 |
| 0.9236111111111112 | 0 |
| 0.9243055555555556 | 0 |
| 0.9249999999999999 | 0 |
| 0.9256944444444444 | 0 |
| 0.9263888888888889 | 0 |
| 0.9270833333333334 | 0 |
| 0.9277777777777777 | 0 |
| 0.9284722222222223 | 0 |
| 0.9291666666666667 | 0 |
| 0.9298611111111111 | 0 |
| 0.9305555555555555 | 0 |
| 0.93125 | 0 |
| 0.9319444444444445 | 0 |
| 0.9326388888888889 | 0 |
| 0.9333333333333332 | 0 |
| 0.9340277777777778 | 0 |
| 0.9347222222222222 | 0 |
| 0.9354166666666667 | 0 |
| 0.936111111111111 | 0 |
| 0.9368055555555556 | 0 |
| 0.9375 | 0 |
| 0.9381944444444444 | 0 |
| 0.938888888888889 | 0 |
| 0.9395833333333333 | 0 |
| 0.9402777777777778 | 0 |
| 0.9409722222222222 | 0 |
| 0.9416666666666668 | 0 |
| 0.9423611111111111 | 0 |
| 0.9430555555555555 | 0 |
| 0.94375 | 0 |
| 0.9444444444444445 | 0 |
| 0.9451388888888889 | 0 |
| 0.9458333333333333 | 0 |
| 0.9465277777777777 | 0 |
| 0.9472222222222223 | 0 |
| 0.9479166666666666 | 0 |
| 0.9486111111111111 | 0 |
| 0.9493055555555556 | 0 |
| 0.9500000000000001 | 0 |
| 0.9506944444444444 | 0 |
| 0.9513888888888888 | 0 |
| 0.9520833333333334 | 0 |
| 0.9527777777777778 | 0 |
| 0.9534722222222222 | 0 |
| 0.9541666666666666 | 0 |
| 0.9548611111111112 | 0 |
| 0.9555555555555556 | 0 |
| 0.9562499999999999 | 0 |
| 0.9569444444444444 | 0 |
| 0.9576388888888889 | 0 |
| 0.9583333333333334 | 0 |
| 0.9590277777777777 | 0 |
| 0.9597222222222223 | 0 |
| 0.9604166666666667 | 0 |
| 0.9611111111111111 | 0 |
| 0.9618055555555555 | 0 |
| 0.9625 | 0 |
| 0.9631944444444445 | 0 |
| 0.9638888888888889 | 0 |
| 0.9645833333333332 | 0 |
| 0.9652777777777778 | 0 |
| 0.9659722222222222 | 0 |
| 0.9666666666666667 | 0 |
| 0.967361111111111 | 0 |
| 0.9680555555555556 | 0 |
| 0.96875 | 0 |
| 0.9694444444444444 | 0 |
| 0.970138888888889 | 0 |
| 0.9708333333333333 | 0 |
| 0.9715277777777778 | 0 |
| 0.9722222222222222 | 0 |
| 0.9729166666666668 | 0 |
| 0.9736111111111111 | 0 |
| 0.9743055555555555 | 0 |
| 0.975 | 0 |
| 0.9756944444444445 | 0 |
| 0.9763888888888889 | 0 |
| 0.9770833333333333 | 0 |
| 0.9777777777777777 | 0 |
| 0.9784722222222223 | 0 |
| 0.9791666666666666 | 0 |
| 0.9798611111111111 | 0 |
| 0.9805555555555556 | 0 |
| 0.9812500000000001 | 0 |
| 0.9819444444444444 | 0 |
| 0.9826388888888888 | 0 |
| 0.9833333333333334 | 0 |
| 0.9840277777777778 | 0 |
| 0.9847222222222222 | 0 |
| 0.9854166666666666 | 0 |
| 0.9861111111111112 | 0 |
| 0.9868055555555556 | 0 |
| 0.9874999999999999 | 0 |
| 0.9881944444444444 | 0 |
| 0.9888888888888889 | 0 |
| 0.9895833333333334 | 0 |
| 0.9902777777777777 | 0 |
| 0.9909722222222223 | 0 |
| 0.9916666666666667 | 0 |
| 0.9923611111111111 | 0 |
| 0.9930555555555555 | 0 |
| 0.99375 | 0 |
| 0.9944444444444445 | 0 |
| 0.9951388888888889 | 0 |
| 0.9958333333333332 | 0 |
| 0.9965277777777778 | 0 |
| 0.9972222222222222 | 0 |
| 0.9979166666666667 | 0 |
| 0.998611111111111 | 0 |
| 0.9993055555555556 | 0 |